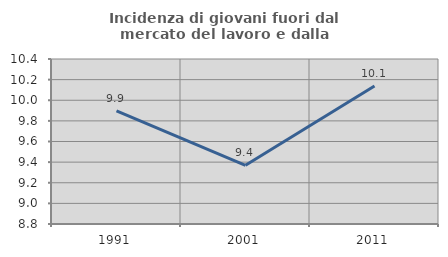
| Category | Incidenza di giovani fuori dal mercato del lavoro e dalla formazione  |
|---|---|
| 1991.0 | 9.897 |
| 2001.0 | 9.369 |
| 2011.0 | 10.138 |